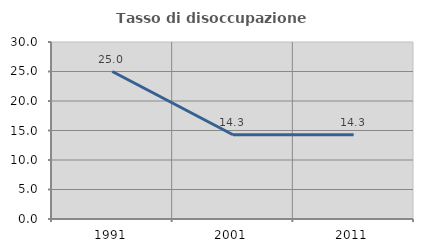
| Category | Tasso di disoccupazione giovanile  |
|---|---|
| 1991.0 | 25 |
| 2001.0 | 14.286 |
| 2011.0 | 14.286 |